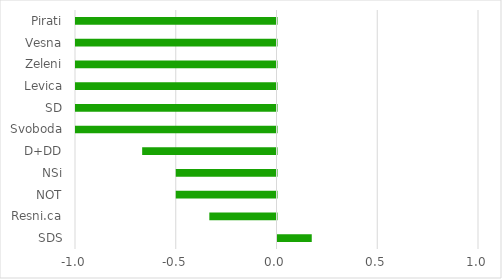
| Category | Series 0 |
|---|---|
| SDS | 0.17 |
| Resni.ca | -0.333 |
| NOT | -0.5 |
| NSi | -0.5 |
| D+DD | -0.667 |
| Svoboda | -1 |
| SD | -1 |
| Levica | -1 |
| Zeleni | -1 |
| Vesna | -1 |
| Pirati | -1 |